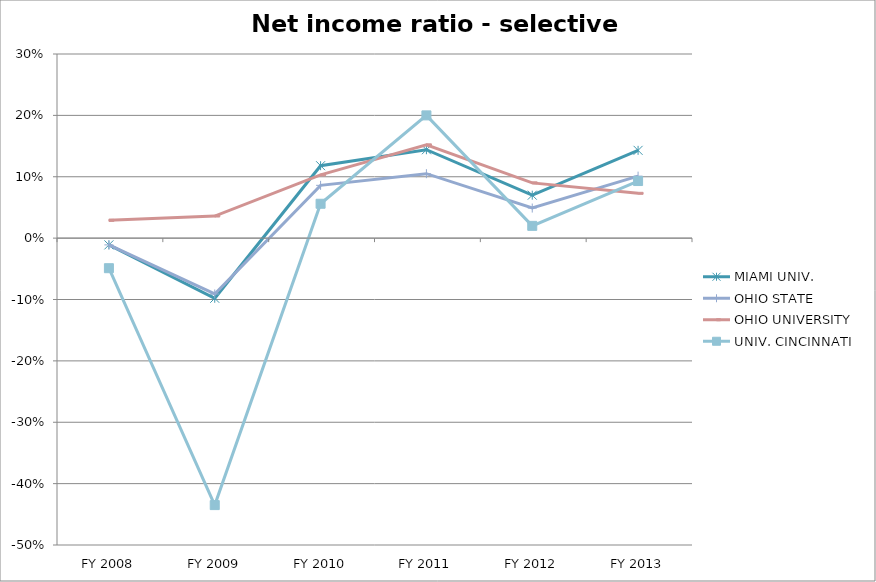
| Category | MIAMI UNIV.  | OHIO STATE  | OHIO UNIVERSITY  | UNIV. CINCINNATI  |
|---|---|---|---|---|
| FY 2013 | 0.143 | 0.101 | 0.073 | 0.093 |
| FY 2012 | 0.07 | 0.049 | 0.09 | 0.02 |
| FY 2011 | 0.144 | 0.105 | 0.152 | 0.2 |
| FY 2010 | 0.118 | 0.086 | 0.103 | 0.056 |
| FY 2009 | -0.098 | -0.091 | 0.036 | -0.435 |
| FY 2008 | -0.011 | -0.011 | 0.029 | -0.049 |